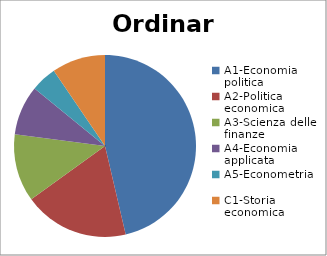
| Category | Ordinari | Series 1 |
|---|---|---|
| A1-Economia politica | 273 |  |
| A2-Politica economica | 110 |  |
| A3-Scienza delle finanze | 71 |  |
| A4-Economia applicata | 52 |  |
| A5-Econometria | 27 |  |
| C1-Storia economica | 56 |  |